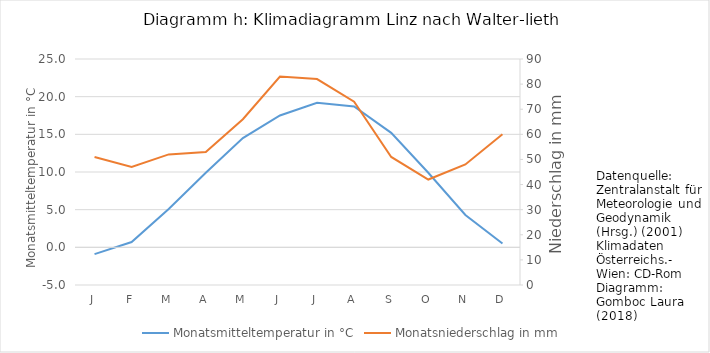
| Category | Monatsmitteltemperatur in °C |
|---|---|
| J | -0.9 |
| F | 0.7 |
| M | 5.1 |
| A | 9.9 |
| M | 14.5 |
| J | 17.5 |
| J | 19.2 |
| A | 18.7 |
| S | 15.2 |
| O | 9.9 |
| N | 4.3 |
| D | 0.5 |